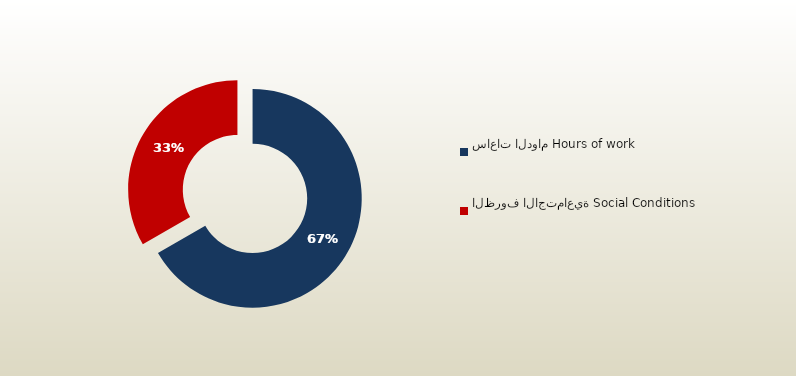
| Category | المجموع
Total |
|---|---|
| ساعات الدوام Hours of work | 140 |
| الظروف الاجتماعية Social Conditions | 70 |